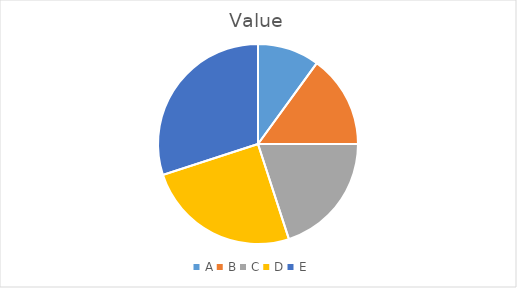
| Category | Value |
|---|---|
| A | 100 |
| B | 150 |
| C | 200 |
| D | 250 |
| E | 300 |